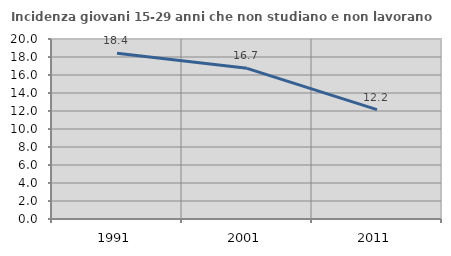
| Category | Incidenza giovani 15-29 anni che non studiano e non lavorano  |
|---|---|
| 1991.0 | 18.427 |
| 2001.0 | 16.738 |
| 2011.0 | 12.153 |